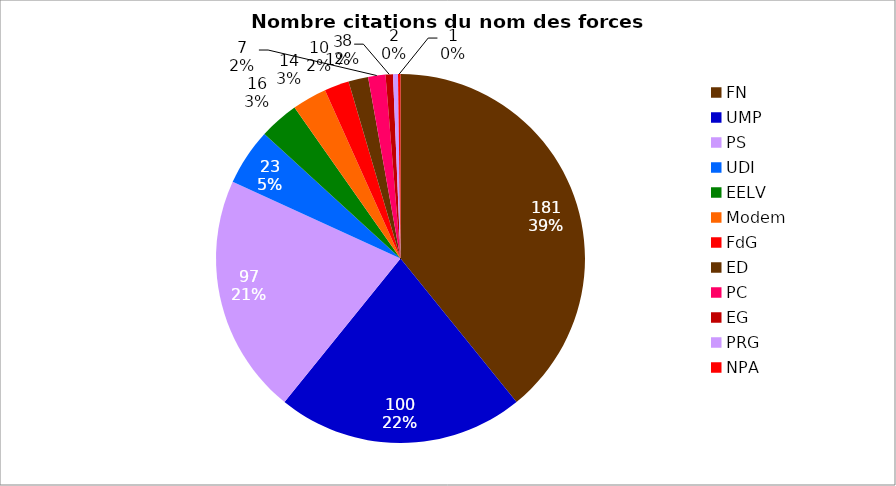
| Category | Total |
|---|---|
| FN  | 181 |
| UMP  | 100 |
| PS  | 97 |
| UDI  | 23 |
| EELV  | 16 |
| Modem  | 14 |
| FdG  | 10 |
| ED  | 8 |
| PC  | 7 |
| EG  | 3 |
| PRG  | 2 |
| NPA  | 1 |